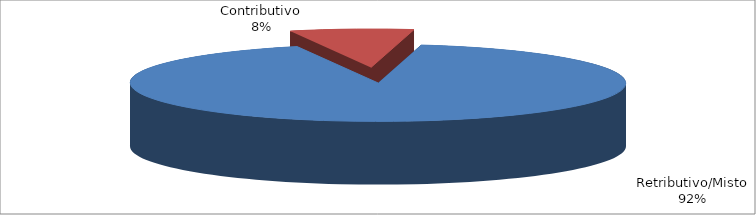
| Category | Decorrenti gennaio - settembre 2022 |
|---|---|
| Retributivo/Misto | 219715 |
| Contributivo | 19281 |